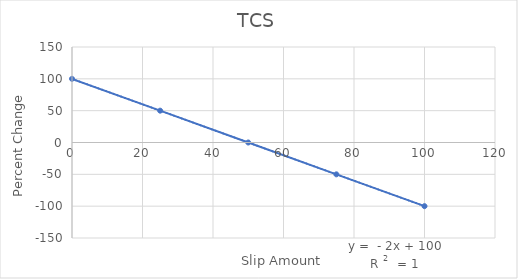
| Category | Series 0 |
|---|---|
| 0.0 | 100 |
| 25.0 | 50 |
| 50.0 | 0 |
| 75.0 | -50 |
| 100.0 | -100 |